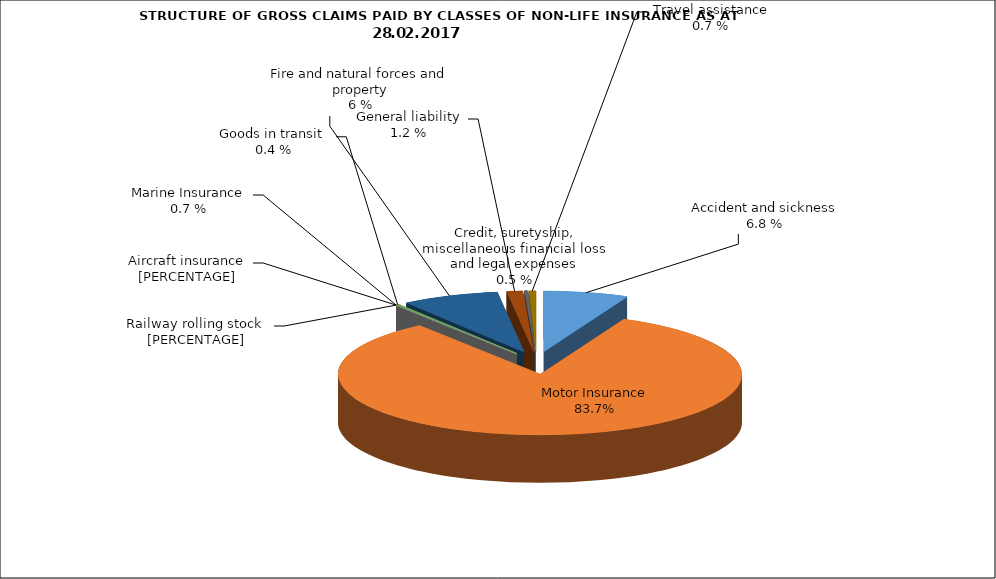
| Category | Злополука и заболяване МПС Релсови превозни средства Летателни апарати Плаванелни съдове Товари по време на превоз Пожар и природни бедствия и други щети на имущество Обща гражданска отговорност Кредити, гаранции, разни финансови загуби и правни разноски |
|---|---|
| Злополука и заболяване | 0.068 |
| МПС | 0.831 |
| Релсови превозни средства | 0 |
| Летателни апарати | 0 |
| Плаванелни съдове | 0 |
| Товари по време на превоз | 0.002 |
| Пожар и природни бедствия и други щети на имущество | 0.078 |
| Обща гражданска отговорност | 0.013 |
| Кредити, гаранции, разни финансови загуби и правни разноски | 0.003 |
| Помощ при пътуване | 0.006 |